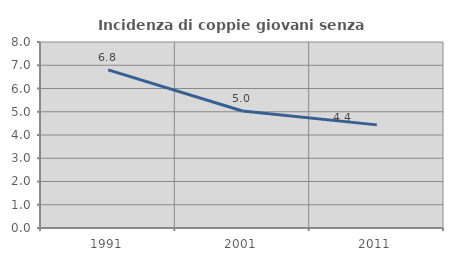
| Category | Incidenza di coppie giovani senza figli |
|---|---|
| 1991.0 | 6.801 |
| 2001.0 | 5.033 |
| 2011.0 | 4.435 |